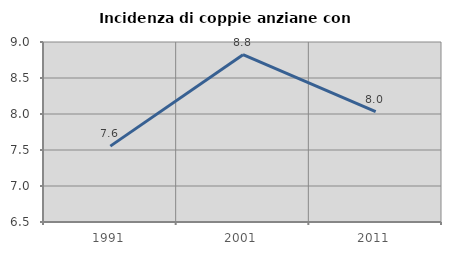
| Category | Incidenza di coppie anziane con figli |
|---|---|
| 1991.0 | 7.554 |
| 2001.0 | 8.824 |
| 2011.0 | 8.032 |